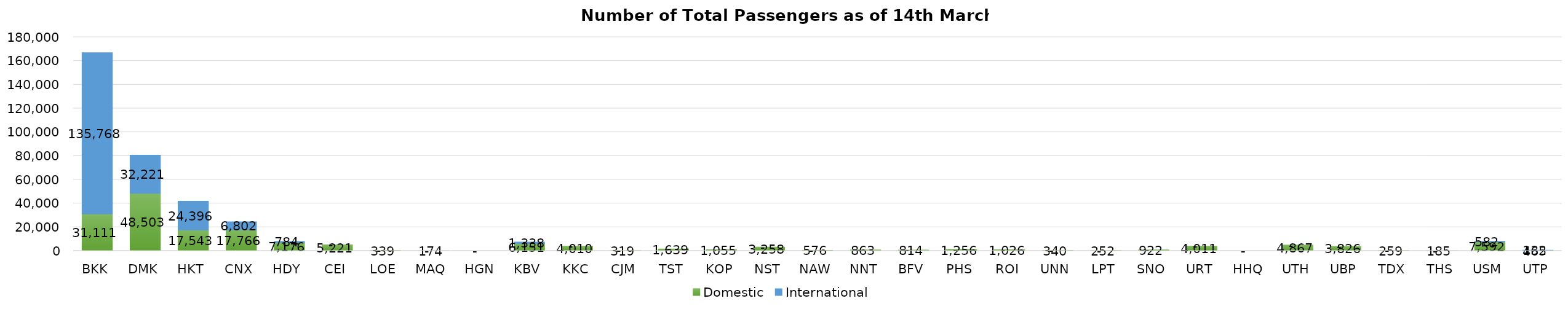
| Category | Domestic | International |
|---|---|---|
| BKK | 31111 | 135768 |
| DMK | 48503 | 32221 |
| HKT | 17543 | 24396 |
| CNX | 17766 | 6802 |
| HDY | 7176 | 784 |
| CEI | 5221 | 0 |
| LOE | 339 | 0 |
| MAQ | 174 | 0 |
| HGN | 0 | 0 |
| KBV | 6151 | 1338 |
| KKC | 4010 | 0 |
| CJM | 319 | 0 |
| TST | 1639 | 0 |
| KOP | 1055 | 0 |
| NST | 3258 | 0 |
| NAW | 576 | 0 |
| NNT | 863 | 0 |
| BFV | 814 | 0 |
| PHS | 1256 | 0 |
| ROI | 1026 | 0 |
| UNN | 340 | 0 |
| LPT | 252 | 0 |
| SNO | 922 | 0 |
| URT | 4011 | 0 |
| HHQ | 0 | 0 |
| UTH | 4867 | 0 |
| UBP | 3826 | 0 |
| TDX | 259 | 0 |
| THS | 185 | 0 |
| USM | 7592 | 582 |
| UTP | 465 | 132 |